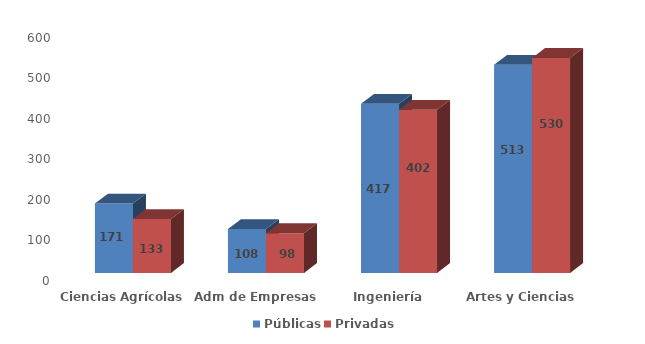
| Category | Públicas | Privadas |
|---|---|---|
| Ciencias Agrícolas | 171 | 133 |
| Adm de Empresas | 108 | 98 |
| Ingeniería | 417 | 402 |
| Artes y Ciencias | 513 | 530 |